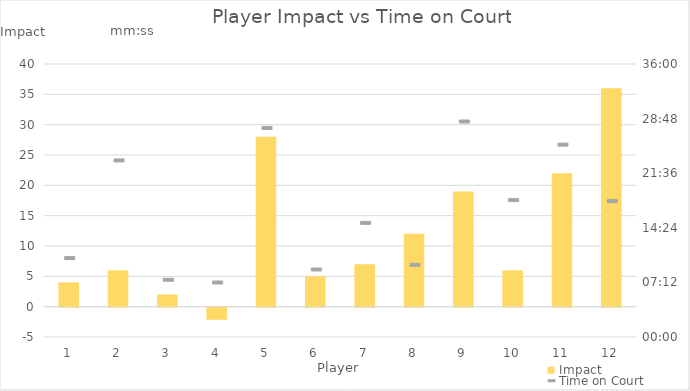
| Category | Impact |
|---|---|
| 0 | 4 |
| 1 | 6 |
| 2 | 2 |
| 3 | -2 |
| 4 | 28 |
| 5 | 5 |
| 6 | 7 |
| 7 | 12 |
| 8 | 19 |
| 9 | 6 |
| 10 | 22 |
| 11 | 36 |